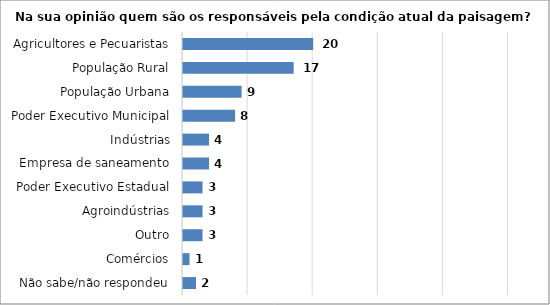
| Category | Series 0 |
|---|---|
| Não sabe/não respondeu | 2 |
| Comércios | 1 |
| Outro | 3 |
| Agroindústrias | 3 |
| Poder Executivo Estadual | 3 |
| Empresa de saneamento | 4 |
| Indústrias | 4 |
| Poder Executivo Municipal | 8 |
| População Urbana | 9 |
| População Rural | 17 |
| Agricultores e Pecuaristas | 20 |